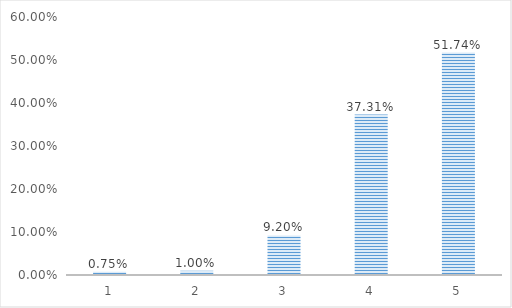
| Category | Series 0 |
|---|---|
| 1.0 | 0.007 |
| 2.0 | 0.01 |
| 3.0 | 0.092 |
| 4.0 | 0.373 |
| 5.0 | 0.517 |